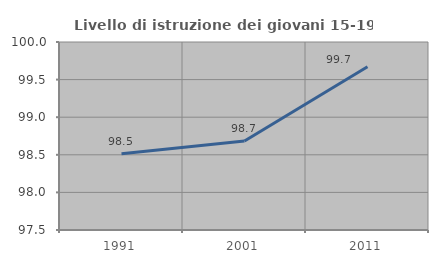
| Category | Livello di istruzione dei giovani 15-19 anni |
|---|---|
| 1991.0 | 98.514 |
| 2001.0 | 98.684 |
| 2011.0 | 99.67 |